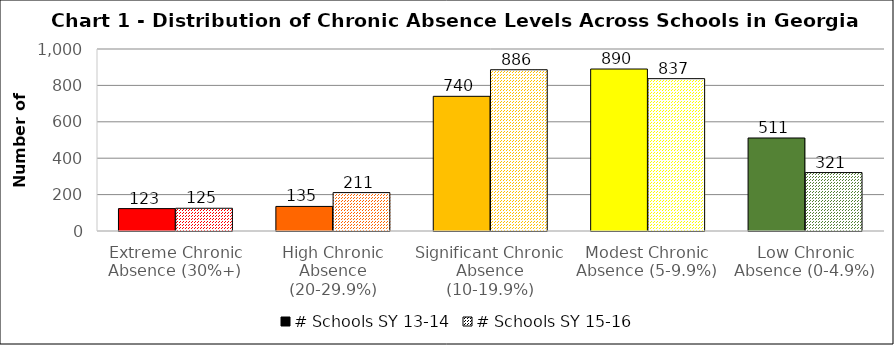
| Category | # Schools SY 13-14 | # Schools SY 15-16 |
|---|---|---|
| Extreme Chronic Absence (30%+) | 123 | 125 |
| High Chronic Absence (20-29.9%) | 135 | 211 |
| Significant Chronic Absence (10-19.9%) | 740 | 886 |
| Modest Chronic Absence (5-9.9%) | 890 | 837 |
| Low Chronic Absence (0-4.9%) | 511 | 321 |